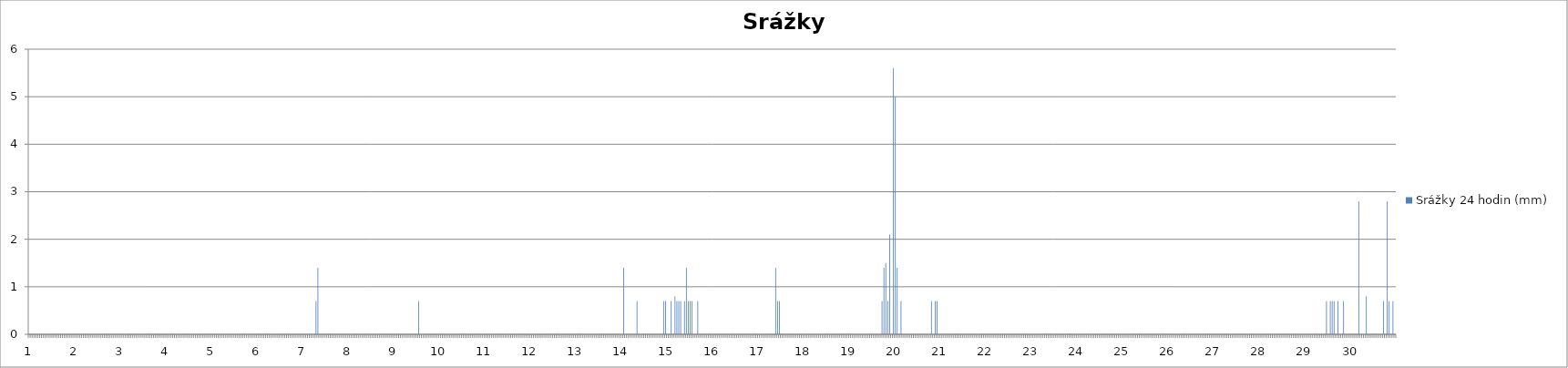
| Category | Srážky 24 hodin (mm) |
|---|---|
| 0 | 0 |
| 1 | 0 |
| 2 | 0 |
| 3 | 0 |
| 4 | 0 |
| 5 | 0 |
| 6 | 0 |
| 7 | 0 |
| 8 | 0 |
| 9 | 0 |
| 10 | 0 |
| 11 | 0 |
| 12 | 0 |
| 13 | 0 |
| 14 | 0 |
| 15 | 0 |
| 16 | 0 |
| 17 | 0 |
| 18 | 0 |
| 19 | 0 |
| 20 | 0 |
| 21 | 0 |
| 22 | 0 |
| 23 | 0 |
| 24 | 0 |
| 25 | 0 |
| 26 | 0 |
| 27 | 0 |
| 28 | 0 |
| 29 | 0 |
| 30 | 0 |
| 31 | 0 |
| 32 | 0 |
| 33 | 0 |
| 34 | 0 |
| 35 | 0 |
| 36 | 0 |
| 37 | 0 |
| 38 | 0 |
| 39 | 0 |
| 40 | 0 |
| 41 | 0 |
| 42 | 0 |
| 43 | 0 |
| 44 | 0 |
| 45 | 0 |
| 46 | 0 |
| 47 | 0 |
| 48 | 0 |
| 49 | 0 |
| 50 | 0 |
| 51 | 0 |
| 52 | 0 |
| 53 | 0 |
| 54 | 0 |
| 55 | 0 |
| 56 | 0 |
| 57 | 0 |
| 58 | 0 |
| 59 | 0 |
| 60 | 0 |
| 61 | 0 |
| 62 | 0 |
| 63 | 0 |
| 64 | 0 |
| 65 | 0 |
| 66 | 0 |
| 67 | 0 |
| 68 | 0 |
| 69 | 0 |
| 70 | 0 |
| 71 | 0 |
| 72 | 0 |
| 73 | 0 |
| 74 | 0 |
| 75 | 0 |
| 76 | 0 |
| 77 | 0 |
| 78 | 0 |
| 79 | 0 |
| 80 | 0 |
| 81 | 0 |
| 82 | 0 |
| 83 | 0 |
| 84 | 0 |
| 85 | 0 |
| 86 | 0 |
| 87 | 0 |
| 88 | 0 |
| 89 | 0 |
| 90 | 0 |
| 91 | 0 |
| 92 | 0 |
| 93 | 0 |
| 94 | 0 |
| 95 | 0 |
| 96 | 0 |
| 97 | 0 |
| 98 | 0 |
| 99 | 0 |
| 100 | 0 |
| 101 | 0 |
| 102 | 0 |
| 103 | 0 |
| 104 | 0 |
| 105 | 0 |
| 106 | 0 |
| 107 | 0 |
| 108 | 0 |
| 109 | 0 |
| 110 | 0 |
| 111 | 0 |
| 112 | 0 |
| 113 | 0 |
| 114 | 0 |
| 115 | 0 |
| 116 | 0 |
| 117 | 0 |
| 118 | 0 |
| 119 | 0 |
| 120 | 0 |
| 121 | 0 |
| 122 | 0 |
| 123 | 0 |
| 124 | 0 |
| 125 | 0 |
| 126 | 0 |
| 127 | 0 |
| 128 | 0 |
| 129 | 0 |
| 130 | 0 |
| 131 | 0 |
| 132 | 0 |
| 133 | 0 |
| 134 | 0 |
| 135 | 0 |
| 136 | 0 |
| 137 | 0 |
| 138 | 0 |
| 139 | 0 |
| 140 | 0 |
| 141 | 0 |
| 142 | 0 |
| 143 | 0 |
| 144 | 0 |
| 145 | 0 |
| 146 | 0 |
| 147 | 0 |
| 148 | 0 |
| 149 | 0 |
| 150 | 0 |
| 151 | 0.7 |
| 152 | 1.4 |
| 153 | 0 |
| 154 | 0 |
| 155 | 0 |
| 156 | 0 |
| 157 | 0 |
| 158 | 0 |
| 159 | 0 |
| 160 | 0 |
| 161 | 0 |
| 162 | 0 |
| 163 | 0 |
| 164 | 0 |
| 165 | 0 |
| 166 | 0 |
| 167 | 0 |
| 168 | 0 |
| 169 | 0 |
| 170 | 0 |
| 171 | 0 |
| 172 | 0 |
| 173 | 0 |
| 174 | 0 |
| 175 | 0 |
| 176 | 0 |
| 177 | 0 |
| 178 | 0 |
| 179 | 0 |
| 180 | 0 |
| 181 | 0 |
| 182 | 0 |
| 183 | 0 |
| 184 | 0 |
| 185 | 0 |
| 186 | 0 |
| 187 | 0 |
| 188 | 0 |
| 189 | 0 |
| 190 | 0 |
| 191 | 0 |
| 192 | 0 |
| 193 | 0 |
| 194 | 0 |
| 195 | 0 |
| 196 | 0 |
| 197 | 0 |
| 198 | 0 |
| 199 | 0 |
| 200 | 0 |
| 201 | 0 |
| 202 | 0 |
| 203 | 0 |
| 204 | 0 |
| 205 | 0.7 |
| 206 | 0 |
| 207 | 0 |
| 208 | 0 |
| 209 | 0 |
| 210 | 0 |
| 211 | 0 |
| 212 | 0 |
| 213 | 0 |
| 214 | 0 |
| 215 | 0 |
| 216 | 0 |
| 217 | 0 |
| 218 | 0 |
| 219 | 0 |
| 220 | 0 |
| 221 | 0 |
| 222 | 0 |
| 223 | 0 |
| 224 | 0 |
| 225 | 0 |
| 226 | 0 |
| 227 | 0 |
| 228 | 0 |
| 229 | 0 |
| 230 | 0 |
| 231 | 0 |
| 232 | 0 |
| 233 | 0 |
| 234 | 0 |
| 235 | 0 |
| 236 | 0 |
| 237 | 0 |
| 238 | 0 |
| 239 | 0 |
| 240 | 0 |
| 241 | 0 |
| 242 | 0 |
| 243 | 0 |
| 244 | 0 |
| 245 | 0 |
| 246 | 0 |
| 247 | 0 |
| 248 | 0 |
| 249 | 0 |
| 250 | 0 |
| 251 | 0 |
| 252 | 0 |
| 253 | 0 |
| 254 | 0 |
| 255 | 0 |
| 256 | 0 |
| 257 | 0 |
| 258 | 0 |
| 259 | 0 |
| 260 | 0 |
| 261 | 0 |
| 262 | 0 |
| 263 | 0 |
| 264 | 0 |
| 265 | 0 |
| 266 | 0 |
| 267 | 0 |
| 268 | 0 |
| 269 | 0 |
| 270 | 0 |
| 271 | 0 |
| 272 | 0 |
| 273 | 0 |
| 274 | 0 |
| 275 | 0 |
| 276 | 0 |
| 277 | 0 |
| 278 | 0 |
| 279 | 0 |
| 280 | 0 |
| 281 | 0 |
| 282 | 0 |
| 283 | 0 |
| 284 | 0 |
| 285 | 0 |
| 286 | 0 |
| 287 | 0 |
| 288 | 0 |
| 289 | 0 |
| 290 | 0 |
| 291 | 0 |
| 292 | 0 |
| 293 | 0 |
| 294 | 0 |
| 295 | 0 |
| 296 | 0 |
| 297 | 0 |
| 298 | 0 |
| 299 | 0 |
| 300 | 0 |
| 301 | 0 |
| 302 | 0 |
| 303 | 0 |
| 304 | 0 |
| 305 | 0 |
| 306 | 0 |
| 307 | 0 |
| 308 | 0 |
| 309 | 0 |
| 310 | 0 |
| 311 | 0 |
| 312 | 0 |
| 313 | 1.4 |
| 314 | 0 |
| 315 | 0 |
| 316 | 0 |
| 317 | 0 |
| 318 | 0 |
| 319 | 0 |
| 320 | 0.7 |
| 321 | 0 |
| 322 | 0 |
| 323 | 0 |
| 324 | 0 |
| 325 | 0 |
| 326 | 0 |
| 327 | 0 |
| 328 | 0 |
| 329 | 0 |
| 330 | 0 |
| 331 | 0 |
| 332 | 0 |
| 333 | 0 |
| 334 | 0.7 |
| 335 | 0.7 |
| 336 | 0 |
| 337 | 0 |
| 338 | 0.7 |
| 339 | 0 |
| 340 | 0.8 |
| 341 | 0.7 |
| 342 | 0.7 |
| 343 | 0.7 |
| 344 | 0 |
| 345 | 0.7 |
| 346 | 1.4 |
| 347 | 0.7 |
| 348 | 0.7 |
| 349 | 0.7 |
| 350 | 0 |
| 351 | 0 |
| 352 | 0.7 |
| 353 | 0 |
| 354 | 0 |
| 355 | 0 |
| 356 | 0 |
| 357 | 0 |
| 358 | 0 |
| 359 | 0 |
| 360 | 0 |
| 361 | 0 |
| 362 | 0 |
| 363 | 0 |
| 364 | 0 |
| 365 | 0 |
| 366 | 0 |
| 367 | 0 |
| 368 | 0 |
| 369 | 0 |
| 370 | 0 |
| 371 | 0 |
| 372 | 0 |
| 373 | 0 |
| 374 | 0 |
| 375 | 0 |
| 376 | 0 |
| 377 | 0 |
| 378 | 0 |
| 379 | 0 |
| 380 | 0 |
| 381 | 0 |
| 382 | 0 |
| 383 | 0 |
| 384 | 0 |
| 385 | 0 |
| 386 | 0 |
| 387 | 0 |
| 388 | 0 |
| 389 | 0 |
| 390 | 0 |
| 391 | 0 |
| 392 | 0 |
| 393 | 1.4 |
| 394 | 0.7 |
| 395 | 0.7 |
| 396 | 0 |
| 397 | 0 |
| 398 | 0 |
| 399 | 0 |
| 400 | 0 |
| 401 | 0 |
| 402 | 0 |
| 403 | 0 |
| 404 | 0 |
| 405 | 0 |
| 406 | 0 |
| 407 | 0 |
| 408 | 0 |
| 409 | 0 |
| 410 | 0 |
| 411 | 0 |
| 412 | 0 |
| 413 | 0 |
| 414 | 0 |
| 415 | 0 |
| 416 | 0 |
| 417 | 0 |
| 418 | 0 |
| 419 | 0 |
| 420 | 0 |
| 421 | 0 |
| 422 | 0 |
| 423 | 0 |
| 424 | 0 |
| 425 | 0 |
| 426 | 0 |
| 427 | 0 |
| 428 | 0 |
| 429 | 0 |
| 430 | 0 |
| 431 | 0 |
| 432 | 0 |
| 433 | 0 |
| 434 | 0 |
| 435 | 0 |
| 436 | 0 |
| 437 | 0 |
| 438 | 0 |
| 439 | 0 |
| 440 | 0 |
| 441 | 0 |
| 442 | 0 |
| 443 | 0 |
| 444 | 0 |
| 445 | 0 |
| 446 | 0 |
| 447 | 0 |
| 448 | 0 |
| 449 | 0.7 |
| 450 | 1.4 |
| 451 | 1.5 |
| 452 | 0.7 |
| 453 | 2.1 |
| 454 | 0 |
| 455 | 5.6 |
| 456 | 5 |
| 457 | 1.4 |
| 458 | 0 |
| 459 | 0.7 |
| 460 | 0 |
| 461 | 0 |
| 462 | 0 |
| 463 | 0 |
| 464 | 0 |
| 465 | 0 |
| 466 | 0 |
| 467 | 0 |
| 468 | 0 |
| 469 | 0 |
| 470 | 0 |
| 471 | 0 |
| 472 | 0 |
| 473 | 0 |
| 474 | 0 |
| 475 | 0.7 |
| 476 | 0 |
| 477 | 0.7 |
| 478 | 0.7 |
| 479 | 0 |
| 480 | 0 |
| 481 | 0 |
| 482 | 0 |
| 483 | 0 |
| 484 | 0 |
| 485 | 0 |
| 486 | 0 |
| 487 | 0 |
| 488 | 0 |
| 489 | 0 |
| 490 | 0 |
| 491 | 0 |
| 492 | 0 |
| 493 | 0 |
| 494 | 0 |
| 495 | 0 |
| 496 | 0 |
| 497 | 0 |
| 498 | 0 |
| 499 | 0 |
| 500 | 0 |
| 501 | 0 |
| 502 | 0 |
| 503 | 0 |
| 504 | 0 |
| 505 | 0 |
| 506 | 0 |
| 507 | 0 |
| 508 | 0 |
| 509 | 0 |
| 510 | 0 |
| 511 | 0 |
| 512 | 0 |
| 513 | 0 |
| 514 | 0 |
| 515 | 0 |
| 516 | 0 |
| 517 | 0 |
| 518 | 0 |
| 519 | 0 |
| 520 | 0 |
| 521 | 0 |
| 522 | 0 |
| 523 | 0 |
| 524 | 0 |
| 525 | 0 |
| 526 | 0 |
| 527 | 0 |
| 528 | 0 |
| 529 | 0 |
| 530 | 0 |
| 531 | 0 |
| 532 | 0 |
| 533 | 0 |
| 534 | 0 |
| 535 | 0 |
| 536 | 0 |
| 537 | 0 |
| 538 | 0 |
| 539 | 0 |
| 540 | 0 |
| 541 | 0 |
| 542 | 0 |
| 543 | 0 |
| 544 | 0 |
| 545 | 0 |
| 546 | 0 |
| 547 | 0 |
| 548 | 0 |
| 549 | 0 |
| 550 | 0 |
| 551 | 0 |
| 552 | 0 |
| 553 | 0 |
| 554 | 0 |
| 555 | 0 |
| 556 | 0 |
| 557 | 0 |
| 558 | 0 |
| 559 | 0 |
| 560 | 0 |
| 561 | 0 |
| 562 | 0 |
| 563 | 0 |
| 564 | 0 |
| 565 | 0 |
| 566 | 0 |
| 567 | 0 |
| 568 | 0 |
| 569 | 0 |
| 570 | 0 |
| 571 | 0 |
| 572 | 0 |
| 573 | 0 |
| 574 | 0 |
| 575 | 0 |
| 576 | 0 |
| 577 | 0 |
| 578 | 0 |
| 579 | 0 |
| 580 | 0 |
| 581 | 0 |
| 582 | 0 |
| 583 | 0 |
| 584 | 0 |
| 585 | 0 |
| 586 | 0 |
| 587 | 0 |
| 588 | 0 |
| 589 | 0 |
| 590 | 0 |
| 591 | 0 |
| 592 | 0 |
| 593 | 0 |
| 594 | 0 |
| 595 | 0 |
| 596 | 0 |
| 597 | 0 |
| 598 | 0 |
| 599 | 0 |
| 600 | 0 |
| 601 | 0 |
| 602 | 0 |
| 603 | 0 |
| 604 | 0 |
| 605 | 0 |
| 606 | 0 |
| 607 | 0 |
| 608 | 0 |
| 609 | 0 |
| 610 | 0 |
| 611 | 0 |
| 612 | 0 |
| 613 | 0 |
| 614 | 0 |
| 615 | 0 |
| 616 | 0 |
| 617 | 0 |
| 618 | 0 |
| 619 | 0 |
| 620 | 0 |
| 621 | 0 |
| 622 | 0 |
| 623 | 0 |
| 624 | 0 |
| 625 | 0 |
| 626 | 0 |
| 627 | 0 |
| 628 | 0 |
| 629 | 0 |
| 630 | 0 |
| 631 | 0 |
| 632 | 0 |
| 633 | 0 |
| 634 | 0 |
| 635 | 0 |
| 636 | 0 |
| 637 | 0 |
| 638 | 0 |
| 639 | 0 |
| 640 | 0 |
| 641 | 0 |
| 642 | 0 |
| 643 | 0 |
| 644 | 0 |
| 645 | 0 |
| 646 | 0 |
| 647 | 0 |
| 648 | 0 |
| 649 | 0 |
| 650 | 0 |
| 651 | 0 |
| 652 | 0 |
| 653 | 0 |
| 654 | 0 |
| 655 | 0 |
| 656 | 0 |
| 657 | 0 |
| 658 | 0 |
| 659 | 0 |
| 660 | 0 |
| 661 | 0 |
| 662 | 0 |
| 663 | 0 |
| 664 | 0 |
| 665 | 0 |
| 666 | 0 |
| 667 | 0 |
| 668 | 0 |
| 669 | 0 |
| 670 | 0 |
| 671 | 0 |
| 672 | 0 |
| 673 | 0 |
| 674 | 0 |
| 675 | 0 |
| 676 | 0 |
| 677 | 0 |
| 678 | 0 |
| 679 | 0 |
| 680 | 0 |
| 681 | 0 |
| 682 | 0 |
| 683 | 0.7 |
| 684 | 0 |
| 685 | 0.7 |
| 686 | 0.7 |
| 687 | 0.7 |
| 688 | 0 |
| 689 | 0.7 |
| 690 | 0 |
| 691 | 0 |
| 692 | 0.7 |
| 693 | 0 |
| 694 | 0 |
| 695 | 0 |
| 696 | 0 |
| 697 | 0 |
| 698 | 0 |
| 699 | 0 |
| 700 | 2.8 |
| 701 | 0 |
| 702 | 0 |
| 703 | 0 |
| 704 | 0.8 |
| 705 | 0 |
| 706 | 0 |
| 707 | 0 |
| 708 | 0 |
| 709 | 0 |
| 710 | 0 |
| 711 | 0 |
| 712 | 0 |
| 713 | 0.7 |
| 714 | 0 |
| 715 | 2.8 |
| 716 | 0.7 |
| 717 | 0 |
| 718 | 0.7 |
| 719 | 0 |